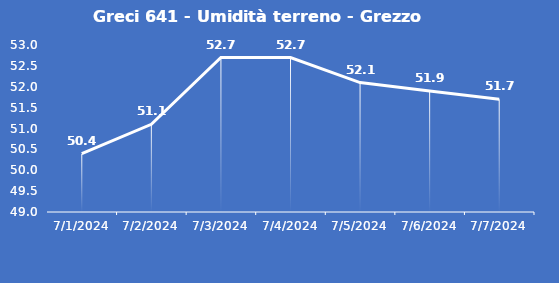
| Category | Greci 641 - Umidità terreno - Grezzo (%VWC) |
|---|---|
| 7/1/24 | 50.4 |
| 7/2/24 | 51.1 |
| 7/3/24 | 52.7 |
| 7/4/24 | 52.7 |
| 7/5/24 | 52.1 |
| 7/6/24 | 51.9 |
| 7/7/24 | 51.7 |